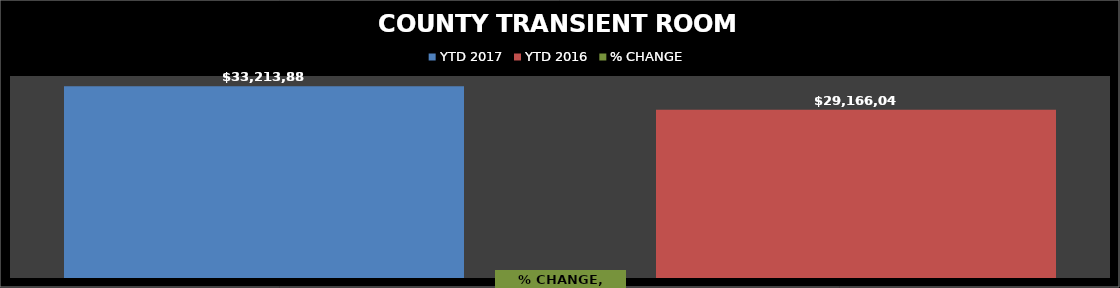
| Category | YTD 2017 | YTD 2016 |
|---|---|---|
| Restaurant Tax Distribution - 2017 | 33213886.69 | 29166044.99 |